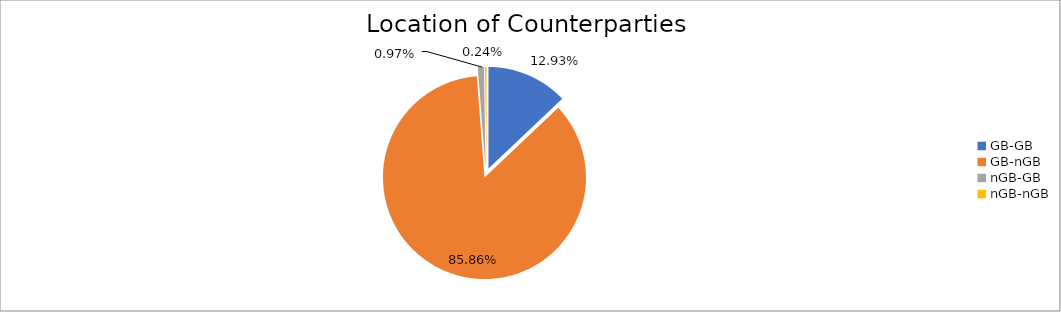
| Category | Series 0 |
|---|---|
| GB-GB | 1229591.87 |
| GB-nGB | 8161731.855 |
| nGB-GB | 91873.957 |
| nGB-nGB | 23070.881 |